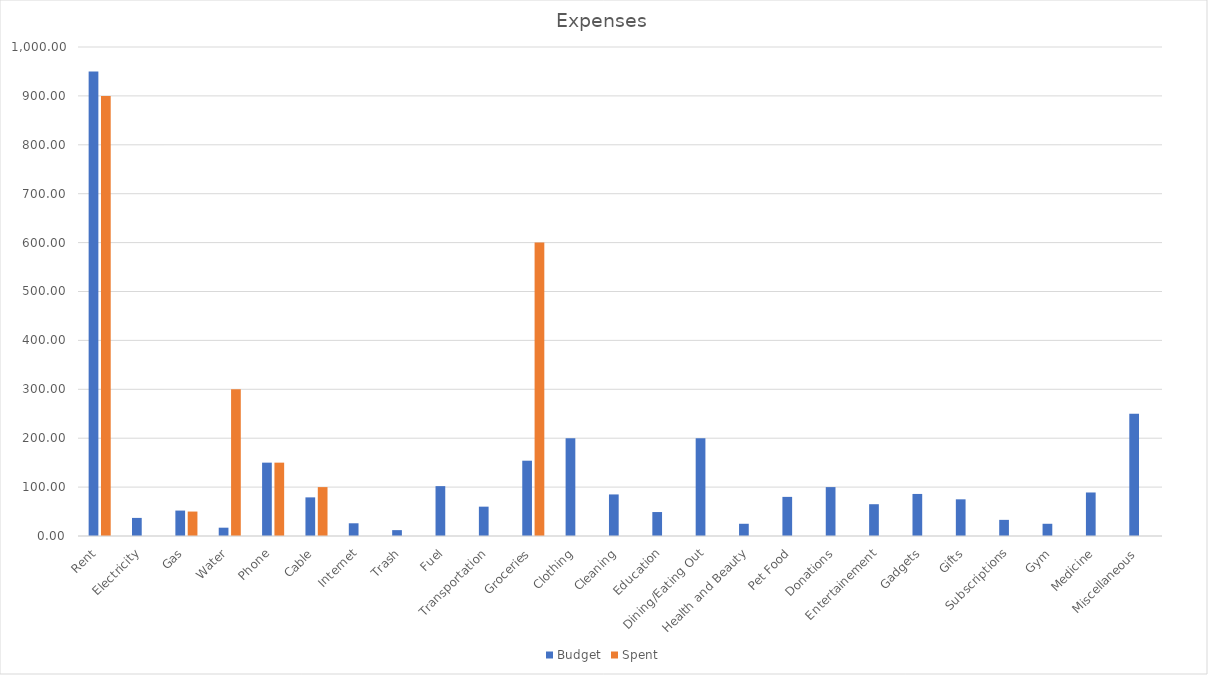
| Category | Budget | Spent |
|---|---|---|
| Rent | 950 | 900 |
| Electricity | 37 | 0 |
| Gas | 52 | 50 |
| Water | 17 | 300 |
| Phone | 150 | 150 |
| Cable | 79 | 100 |
| Internet | 26 | 0 |
| Trash | 12 | 0 |
| Fuel | 102 | 0 |
| Transportation | 60 | 0 |
| Groceries | 154 | 600 |
| Clothing | 200 | 0 |
| Cleaning | 85 | 0 |
| Education | 49 | 0 |
| Dining/Eating Out | 200 | 0 |
| Health and Beauty | 25 | 0 |
| Pet Food | 80 | 0 |
| Donations | 100 | 0 |
| Entertainement | 65 | 0 |
| Gadgets | 86 | 0 |
| Gifts | 75 | 0 |
| Subscriptions | 33 | 0 |
| Gym | 25 | 0 |
| Medicine | 89 | 0 |
| Miscellaneous | 250 | 0 |